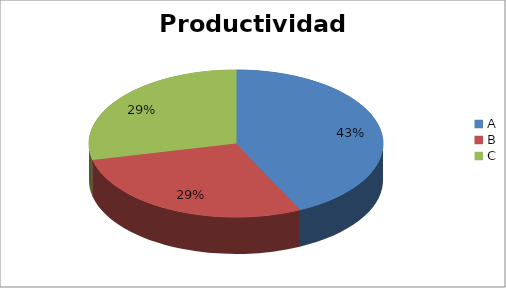
| Category | Series 0 |
|---|---|
| A | 42.857 |
| B | 28.571 |
| C | 28.571 |